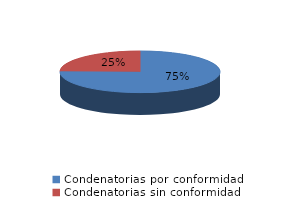
| Category | Series 0 |
|---|---|
| 0 | 101 |
| 1 | 33 |